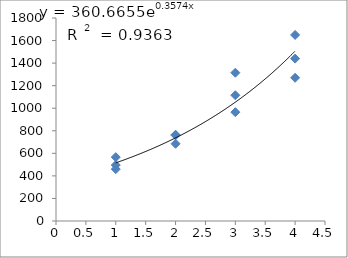
| Category | Series 0 |
|---|---|
| 1.0 | 460 |
| 1.0 | 496 |
| 1.0 | 566 |
| 2.0 | 765 |
| 2.0 | 760 |
| 2.0 | 685 |
| 3.0 | 1115 |
| 3.0 | 965 |
| 3.0 | 1315 |
| 4.0 | 1440 |
| 4.0 | 1650 |
| 4.0 | 1270 |